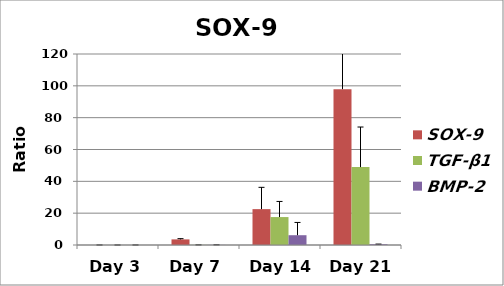
| Category | SOX-9 | TGF-β1 | BMP-2 |
|---|---|---|---|
| Day 3 | 0.014 | 0.001 | 0.005 |
| Day 7 | 3.527 | 0.058 | 0.061 |
| Day 14 | 22.536 | 17.555 | 6.149 |
| Day 21 | 97.915 | 48.935 | 0.47 |